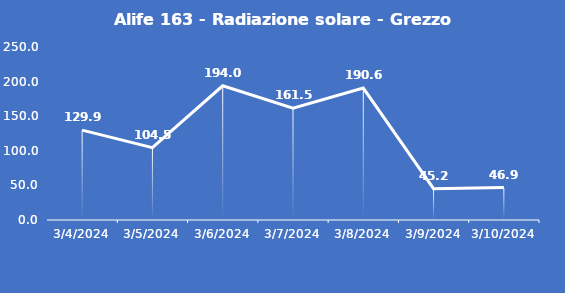
| Category | Alife 163 - Radiazione solare - Grezzo (W/m2) |
|---|---|
| 3/4/24 | 129.9 |
| 3/5/24 | 104.5 |
| 3/6/24 | 194 |
| 3/7/24 | 161.5 |
| 3/8/24 | 190.6 |
| 3/9/24 | 45.2 |
| 3/10/24 | 46.9 |